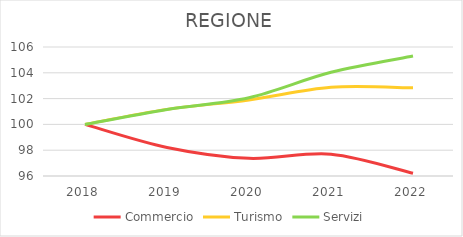
| Category | Commercio | Turismo | Servizi |
|---|---|---|---|
| 2018.0 | 100 | 100 | 100 |
| 2019.0 | 98.211 | 101.164 | 101.162 |
| 2020.0 | 97.366 | 101.897 | 102.071 |
| 2021.0 | 97.694 | 102.878 | 104.037 |
| 2022.0 | 96.217 | 102.835 | 105.296 |